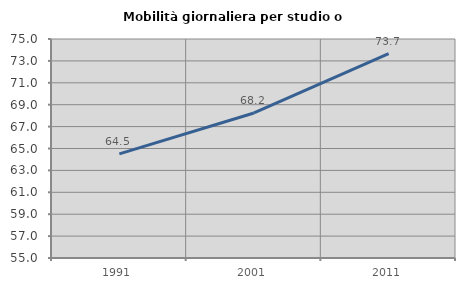
| Category | Mobilità giornaliera per studio o lavoro |
|---|---|
| 1991.0 | 64.514 |
| 2001.0 | 68.242 |
| 2011.0 | 73.668 |